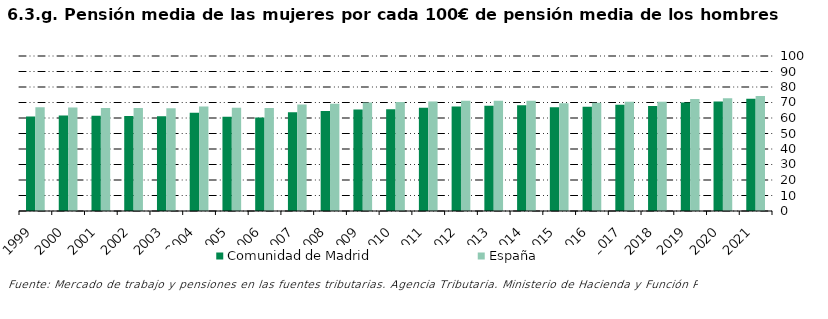
| Category | Comunidad de Madrid | España |
|---|---|---|
| 1999.0 | 60.922 | 66.865 |
| 2000.0 | 61.648 | 66.843 |
| 2001.0 | 61.372 | 66.491 |
| 2002.0 | 61.31 | 66.524 |
| 2003.0 | 61.177 | 66.3 |
| 2004.0 | 63.396 | 67.492 |
| 2005.0 | 60.798 | 66.658 |
| 2006.0 | 60.252 | 66.515 |
| 2007.0 | 63.647 | 68.656 |
| 2008.0 | 64.512 | 69.221 |
| 2009.0 | 65.437 | 70.067 |
| 2010.0 | 65.699 | 70.385 |
| 2011.0 | 66.605 | 70.647 |
| 2012.0 | 67.409 | 71.057 |
| 2013.0 | 67.961 | 71.144 |
| 2014.0 | 68.193 | 71.152 |
| 2015.0 | 66.907 | 69.539 |
| 2016.0 | 67.186 | 69.805 |
| 2017.0 | 68.505 | 70.502 |
| 2018.0 | 67.685 | 70.422 |
| 2019.0 | 70.065 | 72.229 |
| 2020.0 | 70.664 | 72.662 |
| 2021.0 | 72.447 | 74.218 |